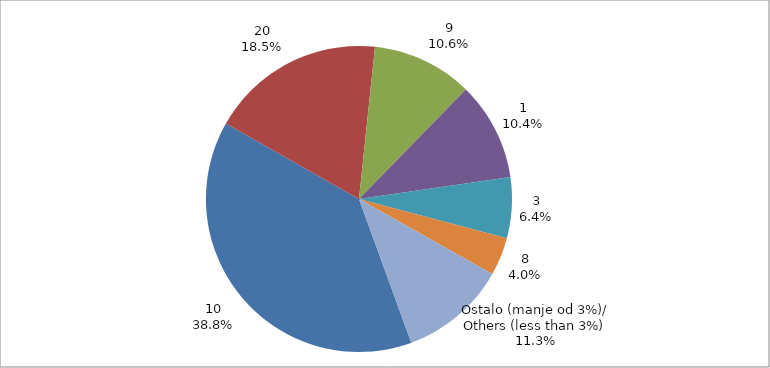
| Category | Series 0 |
|---|---|
| 10 | 0.388 |
| 20 | 0.185 |
| 9 | 0.106 |
| 1 | 0.104 |
| 3 | 0.064 |
| 8 | 0.04 |
| Ostalo (manje od 3%)/
Others (less than 3%) | 0.113 |